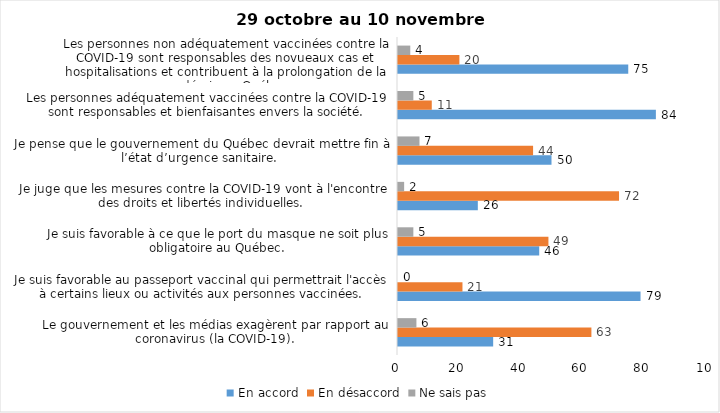
| Category | En accord | En désaccord | Ne sais pas |
|---|---|---|---|
| Le gouvernement et les médias exagèrent par rapport au coronavirus (la COVID-19). | 31 | 63 | 6 |
| Je suis favorable au passeport vaccinal qui permettrait l'accès à certains lieux ou activités aux personnes vaccinées. | 79 | 21 | 0 |
| Je suis favorable à ce que le port du masque ne soit plus obligatoire au Québec. | 46 | 49 | 5 |
| Je juge que les mesures contre la COVID-19 vont à l'encontre des droits et libertés individuelles.  | 26 | 72 | 2 |
| Je pense que le gouvernement du Québec devrait mettre fin à l’état d’urgence sanitaire.  | 50 | 44 | 7 |
| Les personnes adéquatement vaccinées contre la COVID-19 sont responsables et bienfaisantes envers la société. | 84 | 11 | 5 |
| Les personnes non adéquatement vaccinées contre la COVID-19 sont responsables des novueaux cas et hospitalisations et contribuent à la prolongation de la pandémie au Québec. | 75 | 20 | 4 |